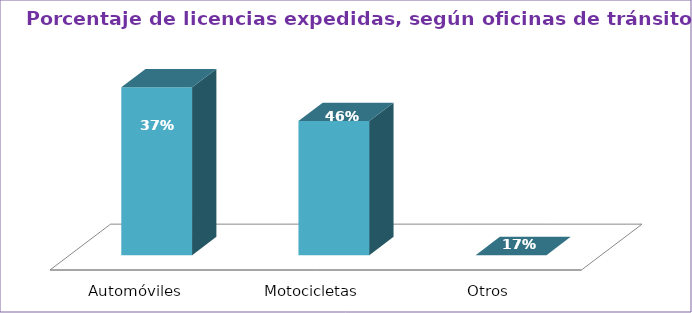
| Category | Series 0 |
|---|---|
| Automóviles  | 55.6 |
| Motocicletas  | 44.4 |
| Otros  | 0 |